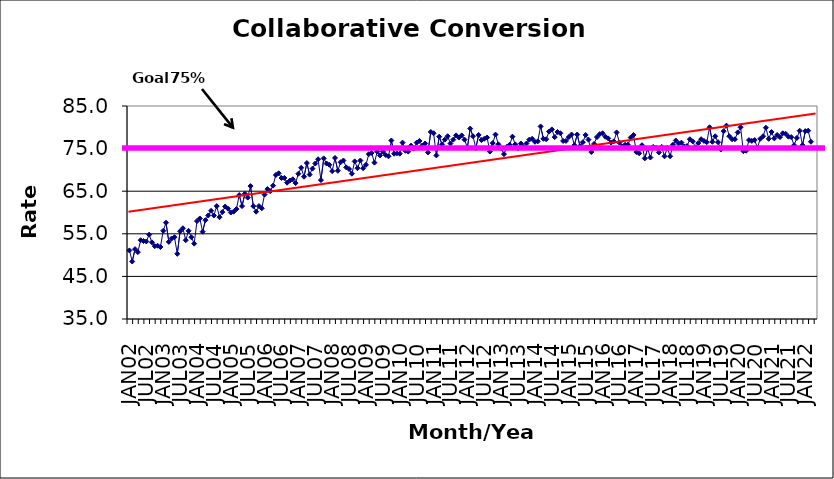
| Category | Series 0 |
|---|---|
| JAN02 | 51.1 |
| FEB02 | 48.5 |
| MAR02 | 51.4 |
| APR02 | 50.7 |
| MAY02 | 53.5 |
| JUN02 | 53.3 |
| JUL02 | 53.2 |
| AUG02 | 54.8 |
| SEP02 | 53 |
| OCT02 | 52.1 |
| NOV02 | 52.2 |
| DEC02 | 51.9 |
| JAN03 | 55.7 |
| FEB03 | 57.6 |
| MAR03 | 53.1 |
| APR03 | 53.9 |
| MAY03 | 54.2 |
| JUN03 | 50.3 |
| JUL03 | 55.6 |
| AUG03 | 56.3 |
| SEP03 | 53.5 |
| OCT03 | 55.7 |
| NOV03 | 54.2 |
| DEC03 | 52.7 |
| JAN04 | 58 |
| FEB04 | 58.6 |
| MAR04 | 55.5 |
| APR04 | 58.2 |
| MAY04 | 59.3 |
| JUN04 | 60.4 |
| JUL04 | 59.3 |
| AUG04 | 61.5 |
| SEP04 | 58.9 |
| OCT04 | 60.1 |
| NOV04 | 61.4 |
| DEC04 | 60.9 |
| JAN05 | 60 |
| FEB05 | 60.2 |
| MAR05 | 60.8 |
| APR05 | 64.1 |
| MAY05 | 61.5 |
| JUN05 | 64.4 |
| JUL05 | 63.5 |
| AUG05 | 66.2 |
| SEP05 | 61.5 |
| OCT05 | 60.2 |
| NOV05 | 61.5 |
| DEC05 | 61 |
| JAN06 | 64.2 |
| FEB06 | 65.5 |
| MAR06 | 65 |
| APR06 | 66.3 |
| MAY06 | 68.8 |
| JUN06 | 69.2 |
| JUL06 | 68.1 |
| AUG06 | 68.1 |
| SEP06 | 67 |
| OCT06 | 67.5 |
| NOV06 | 67.8 |
| DEC06 | 66.9 |
| JAN07 | 69.1 |
| FEB07 | 70.5 |
| MAR07 | 68.4 |
| APR07 | 71.6 |
| MAY07 | 68.9 |
| JUN07 | 70.3 |
| JUL07 | 71.5 |
| AUG07 | 72.5 |
| SEP07 | 67.6 |
| OCT07 | 72.7 |
| NOV07 | 71.5 |
| DEC07 | 71.2 |
| JAN08 | 69.7 |
| FEB08 | 72.8 |
| MAR08 | 69.8 |
| APR08 | 71.8 |
| MAY08 | 72.2 |
| JUN08 | 70.6 |
| JUL08 | 70.2 |
| AUG08 | 69.1 |
| SEP08 | 72 |
| OCT08 | 70.4 |
| NOV08 | 72.2 |
| DEC08 | 70.4 |
| JAN09 | 71.2 |
| FEB09 | 73.7 |
| MAR09 | 74 |
| APR09 | 71.7 |
| MAY09 | 74.3 |
| JUN09 | 73.4 |
| JUL09 | 74.3 |
| AUG09 | 73.5 |
| SEP09 | 73.2 |
| OCT09 | 76.9 |
| NOV09 | 73.8 |
| DEC09 | 73.9 |
| JAN10 | 73.8 |
| FEB10 | 76.4 |
| MAR10 | 74.5 |
| APR10 | 74.3 |
| MAY10 | 75.7 |
| JUN10 | 75 |
| JUL10 | 76.4 |
| AUG10 | 76.8 |
| SEP10 | 75.7 |
| OCT10 | 76.2 |
| NOV10 | 74.1 |
| DEC10 | 78.9 |
| JAN11 | 78.6 |
| FEB11 | 73.4 |
| MAR11 | 77.8 |
| APR11 | 76 |
| MAY11 | 77.1 |
| JUN11 | 77.9 |
| JUL11 | 76.2 |
| AUG11 | 77.1 |
| SEP11 | 78.1 |
| OCT11 | 77.6 |
| NOV11 | 78.1 |
| DEC11 | 77.1 |
| JAN12 | 75.2 |
| FEB12 | 79.7 |
| MAR12 | 77.9 |
| APR12 | 75.1 |
| MAY12 | 78.2 |
| JUN12 | 77 |
| JUL12 | 77.3 |
| AUG12 | 77.6 |
| SEP12 | 74.3 |
| OCT12 | 76.3 |
| NOV12 | 78.3 |
| DEC12 | 76 |
| JAN13 | 75.1 |
| FEB13 | 73.7 |
| MAR13 | 75.4 |
| APR13 | 75.9 |
| MAY13 | 77.8 |
| JUN13 | 76 |
| JUL13 | 75.1 |
| AUG13 | 76.2 |
| SEP13 | 75.4 |
| OCT13 | 76.2 |
| NOV13 | 77.1 |
| DEC13 | 77.3 |
| JAN14 | 76.6 |
| FEB14 | 76.7 |
| MAR14 | 80.2 |
| APR14 | 77.3 |
| MAY14 | 77.2 |
| JUN14 | 79 |
| JUL14 | 79.5 |
| AUG14 | 77.7 |
| SEP14 | 78.9 |
| OCT14 | 78.6 |
| NOV14 | 76.8 |
| DEC14 | 76.8 |
| JAN15 | 77.7 |
| FEB15 | 78.3 |
| MAR15 | 75.8 |
| APR15 | 78.3 |
| MAY15 | 75.6 |
| JUN15 | 76.5 |
| JUL15 | 78.2 |
| AUG15 | 77.1 |
| SEP15 | 74.2 |
| OCT15 | 76.1 |
| NOV15 | 77.7 |
| DEC15 | 78.4 |
| JAN16 | 78.6 |
| FEB16 | 77.8 |
| MAR16 | 77.4 |
| APR16 | 76.4 |
| MAY16 | 76.7 |
| JUN16 | 78.8 |
| JUL16 | 76.4 |
| AUG16 | 75.5 |
| SEP16 | 75.9 |
| OCT16 | 75.9 |
| NOV16 | 77.6 |
| DEC16 | 78.2 |
| JAN17 | 74.2 |
| FEB17 | 73.9 |
| MAR17 | 75.8 |
| APR17 | 72.7 |
| MAY17 | 75 |
| JUN17 | 72.9 |
| JUL17 | 75.4 |
| AUG17 | 75.2 |
| SEP17 | 74.1 |
| OCT17 | 75.4 |
| NOV17 | 73.2 |
| DEC17 | 75.2 |
| JAN18 | 73.2 |
| FEB18 | 75.9 |
| MAR18 | 76.9 |
| APR18 | 76.2 |
| MAY18 | 76.4 |
| JUN18 | 75.5 |
| JUL18 | 75.6 |
| AUG18 | 77.2 |
| SEP18 | 76.7 |
| OCT18 | 75.3 |
| NOV18 | 76.3 |
| DEC18 | 77.2 |
| JAN19 | 76.8 |
| FEB19 | 76.5 |
| MAR19 | 80 |
| APR19 | 76.6 |
| MAY19 | 77.9 |
| JUN19 | 76.5 |
| JUL19 | 74.8 |
| AUG19 | 79.1 |
| SEP19 | 80.4 |
| OCT19 | 77.9 |
| NOV19 | 77.2 |
| DEC19 | 77.2 |
| JAN20 | 78.8 |
| FEB20 | 80 |
| MAR20 | 74.4 |
| APR20 | 74.5 |
| MAY20 | 77 |
| JUN20 | 76.8 |
| JUL20 | 77 |
| AUG20 | 75.2 |
| SEP20 | 77.3 |
| OCT20 | 77.9 |
| NOV20 | 79.9 |
| DEC20 | 77.3 |
| JAN21 | 78.9 |
| FEB21 | 77.4 |
| MAR21 | 78.2 |
| APR21 | 77.7 |
| MAY21 | 78.6 |
| JUN21 | 78.5 |
| JUL21 | 77.8 |
| AUG21 | 77.7 |
| SEP21 | 75.8 |
| OCT21 | 77.5 |
| NOV21 | 79.2 |
| DEC21 | 75.8 |
| JAN22 | 79.1 |
| FEB22 | 79.2 |
| MAR22 | 76.6 |